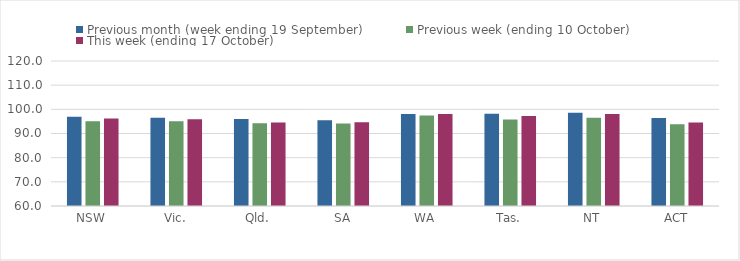
| Category | Previous month (week ending 19 September) | Previous week (ending 10 October) | This week (ending 17 October) |
|---|---|---|---|
| NSW | 96.96 | 95.1 | 96.16 |
| Vic. | 96.48 | 95.02 | 95.87 |
| Qld. | 95.97 | 94.22 | 94.59 |
| SA | 95.51 | 94.11 | 94.7 |
| WA | 98.06 | 97.45 | 98.02 |
| Tas. | 98.19 | 95.82 | 97.27 |
| NT | 98.59 | 96.52 | 98.09 |
| ACT | 96.39 | 93.84 | 94.56 |